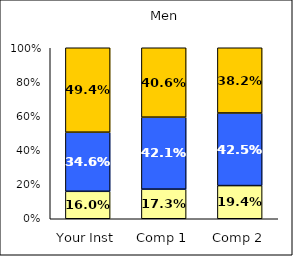
| Category | Low Positive Cross-Racial Interaction | Average Positive Cross-Racial Interaction | High Positive Cross-Racial Interaction |
|---|---|---|---|
| Your Inst | 0.16 | 0.346 | 0.494 |
| Comp 1 | 0.173 | 0.421 | 0.406 |
| Comp 2 | 0.194 | 0.425 | 0.382 |